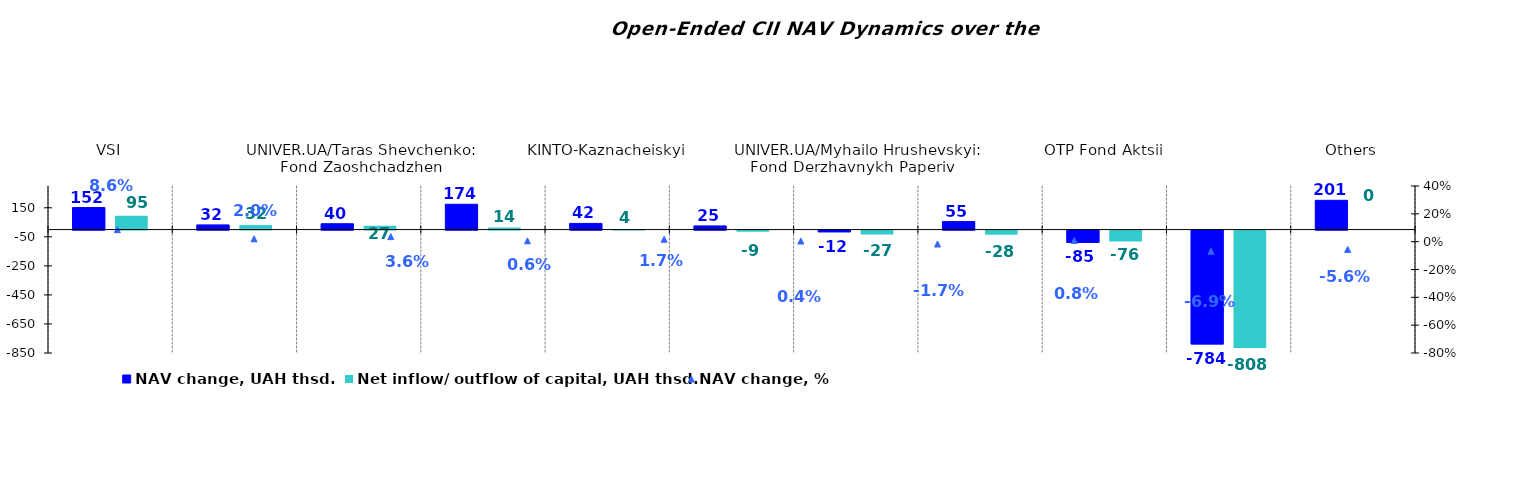
| Category | NAV change, UAH thsd. | Net inflow/ outflow of capital, UAH thsd. |
|---|---|---|
| VSI | 151.639 | 94.956 |
| UNIVER.UA/Volodymyr Velykyi: Fond Zbalansovanyi | 32.272 | 31.545 |
| UNIVER.UA/Taras Shevchenko: Fond Zaoshchadzhen | 40.208 | 26.853 |
| KINTO- Кlasychnyi | 174.269 | 13.99 |
| KINTO-Kaznacheiskyi | 42.367 | 4.177 |
| Nadbannia | 25.26 | -8.976 |
| UNIVER.UA/Myhailo Hrushevskyi: Fond Derzhavnykh Paperiv    | -11.947 | -27.214 |
| UNIVER.UA/Iaroslav Mudryi: Fond Aktsii | 55.09 | -28.165 |
| ОТP Fond Aktsii | -84.76 | -75.66 |
| Bonum Optimum | -783.796 | -807.838 |
| Others | 201.433 | 0 |